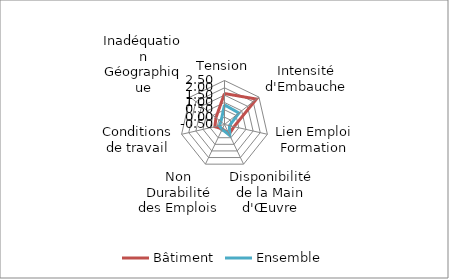
| Category | Bâtiment | Ensemble |
|---|---|---|
| Tension | 1.61 | 0.838 |
| Intensité d'Embauche | 2.282 | 0.756 |
| Lien Emploi Formation | 0.166 | -0.154 |
| Disponibilité de la Main d'Œuvre | 0.228 | 0.329 |
| Non Durabilité des Emplois | -0.168 | -0.133 |
| Conditions de travail | 0.172 | -0.146 |
| Inadéquation Géographique | 0.247 | -0.188 |